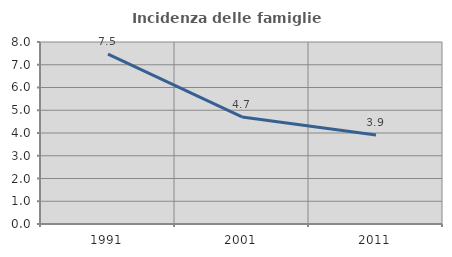
| Category | Incidenza delle famiglie numerose |
|---|---|
| 1991.0 | 7.466 |
| 2001.0 | 4.706 |
| 2011.0 | 3.915 |